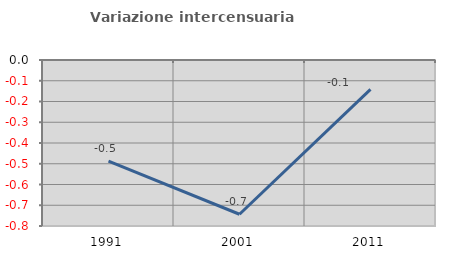
| Category | Variazione intercensuaria annua |
|---|---|
| 1991.0 | -0.488 |
| 2001.0 | -0.743 |
| 2011.0 | -0.142 |